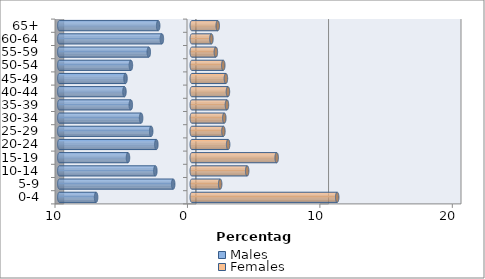
| Category | Males | Females |
|---|---|---|
| 0-4 | -7.224 | 10.98 |
| 5-9 | -1.404 | 2.143 |
| 10-14 | -2.751 | 4.182 |
| 15-19 | -4.817 | 6.411 |
| 20-24 | -2.676 | 2.747 |
| 25-29 | -3.066 | 2.387 |
| 30-34 | -3.827 | 2.455 |
| 35-39 | -4.603 | 2.655 |
| 40-44 | -5.085 | 2.73 |
| 45-49 | -5.004 | 2.576 |
| 50-54 | -4.597 | 2.378 |
| 55-59 | -3.246 | 1.819 |
| 60-64 | -2.257 | 1.481 |
| 65+ | -2.537 | 1.959 |